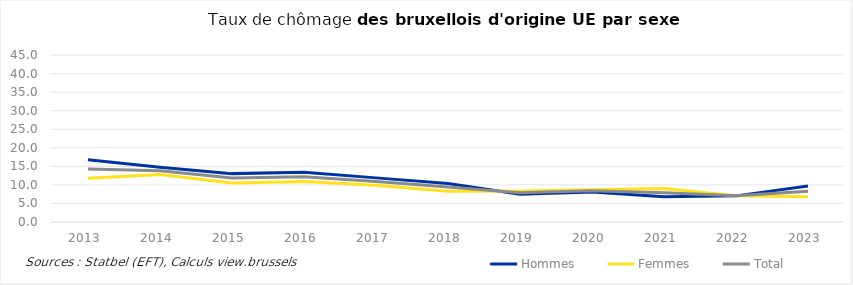
| Category | Hommes | Femmes | Total |
|---|---|---|---|
| 2013.0 | 16.772 | 11.803 | 14.293 |
| 2014.0 | 14.764 | 12.798 | 13.823 |
| 2015.0 | 13.045 | 10.523 | 11.85 |
| 2016.0 | 13.39 | 10.919 | 12.213 |
| 2017.0 | 11.899 | 9.878 | 10.925 |
| 2018.0 | 10.394 | 8.323 | 9.407 |
| 2019.0 | 7.467 | 8.374 | 7.902 |
| 2020.0 | 8.12 | 8.716 | 8.409 |
| 2021.0 | 6.791 | 9.059 | 7.888 |
| 2022.0 | 7.046 | 7.082 | 7.064 |
| 2023.0 | 9.701 | 6.805 | 8.312 |